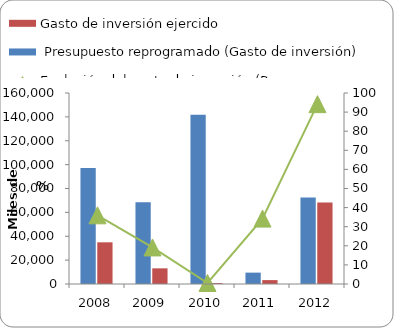
| Category |  Presupuesto reprogramado (Gasto de inversión) | Gasto de inversión ejercido |
|---|---|---|
| 2008 | 97082 | 34913 |
| 2009 | 68514 | 13121 |
| 2010 | 141828 | 763 |
| 2011 | 9529 | 3263 |
| 2012 | 72421.9 | 68198.3 |